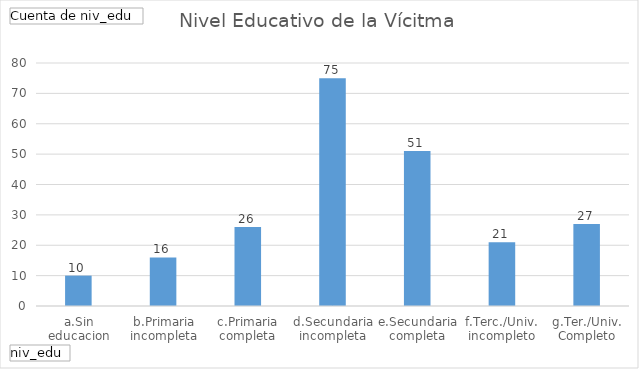
| Category | Total |
|---|---|
| a.Sin educacion | 10 |
| b.Primaria incompleta | 16 |
| c.Primaria completa | 26 |
| d.Secundaria incompleta | 75 |
| e.Secundaria completa | 51 |
| f.Terc./Univ. incompleto | 21 |
| g.Ter./Univ. Completo | 27 |